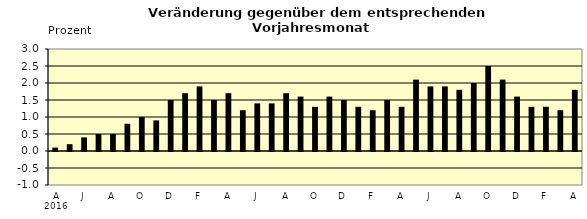
| Category | Series 0 |
|---|---|
| 0 | 0.1 |
| 1 | 0.2 |
| 2 | 0.4 |
| 3 | 0.5 |
| 4 | 0.5 |
| 5 | 0.8 |
| 6 | 1 |
| 7 | 0.9 |
| 8 | 1.5 |
| 9 | 1.7 |
| 10 | 1.9 |
| 11 | 1.5 |
| 12 | 1.7 |
| 13 | 1.2 |
| 14 | 1.4 |
| 15 | 1.4 |
| 16 | 1.7 |
| 17 | 1.6 |
| 18 | 1.3 |
| 19 | 1.6 |
| 20 | 1.5 |
| 21 | 1.3 |
| 22 | 1.2 |
| 23 | 1.5 |
| 24 | 1.3 |
| 25 | 2.1 |
| 26 | 1.9 |
| 27 | 1.9 |
| 28 | 1.8 |
| 29 | 2 |
| 30 | 2.5 |
| 31 | 2.1 |
| 32 | 1.6 |
| 33 | 1.3 |
| 34 | 1.3 |
| 35 | 1.2 |
| 36 | 1.8 |